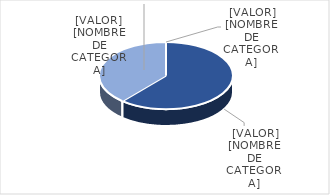
| Category | Series 0 |
|---|---|
| PRESUPUESTO VIGENTE PARA 2023 | 26648782 |
| PRESUPUESTO EJECUTADO  | 16855310.55 |
| PORCENTAJE DE EJECUCIÓN  | 0.632 |